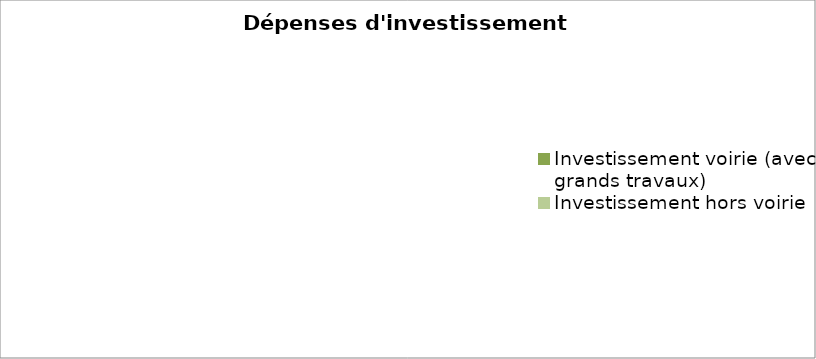
| Category | Series 0 |
|---|---|
| Investissement voirie (avec grands travaux) | 0 |
| Investissement hors voirie | 0 |